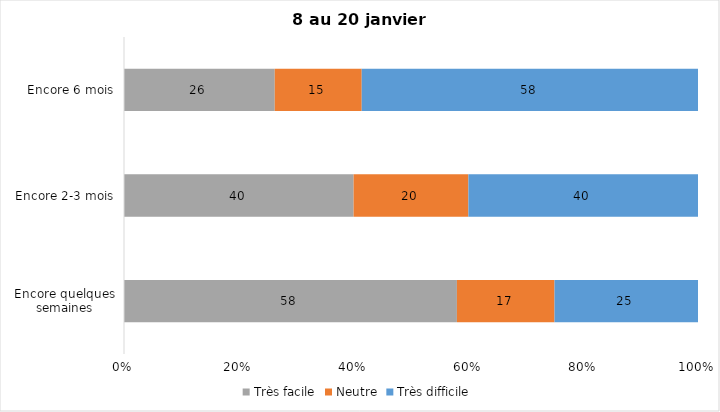
| Category | Très facile | Neutre | Très difficile |
|---|---|---|---|
| Encore quelques semaines | 58 | 17 | 25 |
| Encore 2-3 mois | 40 | 20 | 40 |
| Encore 6 mois | 26 | 15 | 58 |